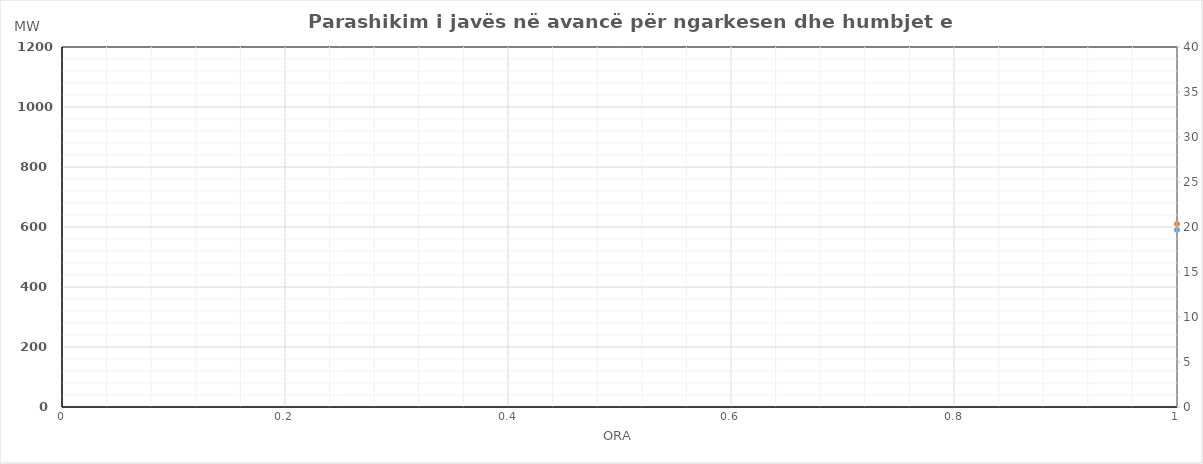
| Category | Ngarkesa (MWh) |
|---|---|
| 0 | 610.31 |
| 1 | 565.26 |
| 2 | 544.12 |
| 3 | 535.19 |
| 4 | 537.88 |
| 5 | 594.96 |
| 6 | 715.99 |
| 7 | 864.07 |
| 8 | 902.3 |
| 9 | 915.21 |
| 10 | 908.41 |
| 11 | 913.28 |
| 12 | 869.55 |
| 13 | 875.68 |
| 14 | 862.85 |
| 15 | 847.74 |
| 16 | 849.96 |
| 17 | 880.45 |
| 18 | 936.24 |
| 19 | 991.17 |
| 20 | 972.52 |
| 21 | 881.81 |
| 22 | 778.99 |
| 23 | 674.52 |
| 24 | 600.37 |
| 25 | 548.05 |
| 26 | 518.53 |
| 27 | 513.34 |
| 28 | 518.11 |
| 29 | 558.3 |
| 30 | 674.47 |
| 31 | 800.95 |
| 32 | 859.24 |
| 33 | 873.77 |
| 34 | 871.85 |
| 35 | 882.7 |
| 36 | 874.88 |
| 37 | 890.62 |
| 38 | 890.01 |
| 39 | 876.04 |
| 40 | 873.13 |
| 41 | 893.9 |
| 42 | 927.78 |
| 43 | 991.18 |
| 44 | 962.8 |
| 45 | 871.7 |
| 46 | 766.7 |
| 47 | 666.23 |
| 48 | 637.19 |
| 49 | 589.28 |
| 50 | 565.76 |
| 51 | 556.38 |
| 52 | 559.84 |
| 53 | 597.07 |
| 54 | 684.3 |
| 55 | 822.4 |
| 56 | 896.63 |
| 57 | 908.97 |
| 58 | 901.05 |
| 59 | 905.75 |
| 60 | 900.78 |
| 61 | 906.56 |
| 62 | 892.46 |
| 63 | 879.87 |
| 64 | 886.89 |
| 65 | 925.39 |
| 66 | 968.51 |
| 67 | 1024.52 |
| 68 | 1016.99 |
| 69 | 921.37 |
| 70 | 822.84 |
| 71 | 714.97 |
| 72 | 606.4 |
| 73 | 560.29 |
| 74 | 537.39 |
| 75 | 530.78 |
| 76 | 533.29 |
| 77 | 571.24 |
| 78 | 652.3 |
| 79 | 797.75 |
| 80 | 881.57 |
| 81 | 913.56 |
| 82 | 915.15 |
| 83 | 913.96 |
| 84 | 907.56 |
| 85 | 917.48 |
| 86 | 901.07 |
| 87 | 884.61 |
| 88 | 890.9 |
| 89 | 916.42 |
| 90 | 954.2 |
| 91 | 1006.22 |
| 92 | 1000.01 |
| 93 | 913.05 |
| 94 | 814.45 |
| 95 | 710.31 |
| 96 | 637.19 |
| 97 | 589.28 |
| 98 | 565.76 |
| 99 | 556.38 |
| 100 | 559.84 |
| 101 | 597.07 |
| 102 | 684.3 |
| 103 | 822.4 |
| 104 | 896.63 |
| 105 | 908.97 |
| 106 | 901.05 |
| 107 | 905.75 |
| 108 | 900.78 |
| 109 | 906.56 |
| 110 | 892.46 |
| 111 | 879.87 |
| 112 | 886.89 |
| 113 | 925.39 |
| 114 | 968.51 |
| 115 | 1024.52 |
| 116 | 1016.99 |
| 117 | 921.37 |
| 118 | 822.84 |
| 119 | 714.97 |
| 120 | 606.4 |
| 121 | 560.29 |
| 122 | 537.39 |
| 123 | 530.78 |
| 124 | 533.29 |
| 125 | 571.24 |
| 126 | 652.3 |
| 127 | 797.75 |
| 128 | 881.57 |
| 129 | 913.56 |
| 130 | 915.15 |
| 131 | 913.96 |
| 132 | 907.56 |
| 133 | 917.48 |
| 134 | 901.07 |
| 135 | 884.61 |
| 136 | 890.9 |
| 137 | 916.42 |
| 138 | 954.2 |
| 139 | 1006.22 |
| 140 | 1000.01 |
| 141 | 913.05 |
| 142 | 814.45 |
| 143 | 710.31 |
| 144 | 599.7 |
| 145 | 558.19 |
| 146 | 533.79 |
| 147 | 522.18 |
| 148 | 524.79 |
| 149 | 561.54 |
| 150 | 645.9 |
| 151 | 771.15 |
| 152 | 852.47 |
| 153 | 874.86 |
| 154 | 886.15 |
| 155 | 899.06 |
| 156 | 906.76 |
| 157 | 911.48 |
| 158 | 896.37 |
| 159 | 886.61 |
| 160 | 890.6 |
| 161 | 912.42 |
| 162 | 934.3 |
| 163 | 979.92 |
| 164 | 974.81 |
| 165 | 891.75 |
| 166 | 799.75 |
| 167 | 693.71 |